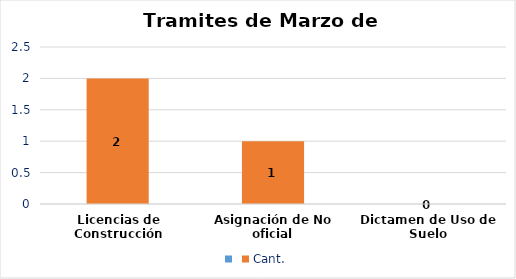
| Category | Series 0 | Cant. |
|---|---|---|
| Licencias de Construcción |  | 2 |
| Asignación de No oficial |  | 1 |
| Dictamen de Uso de Suelo |  | 0 |